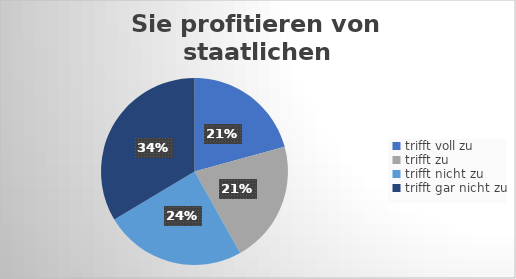
| Category | Sie profitieren von staatlichen Sozialleistungen.  |
|---|---|
| trifft voll zu | 55 |
| trifft zu  | 56 |
| trifft nicht zu  | 65 |
| trifft gar nicht zu | 89 |